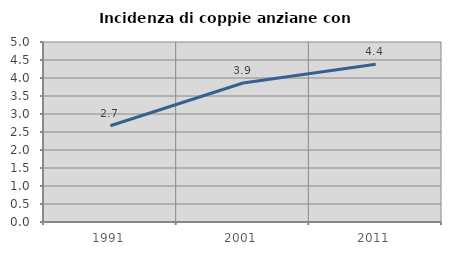
| Category | Incidenza di coppie anziane con figli |
|---|---|
| 1991.0 | 2.673 |
| 2001.0 | 3.862 |
| 2011.0 | 4.38 |